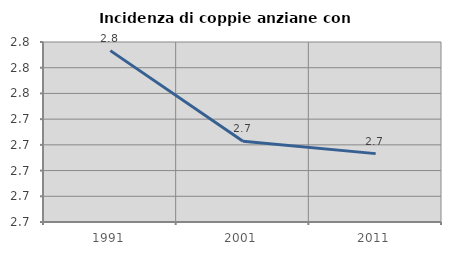
| Category | Incidenza di coppie anziane con figli |
|---|---|
| 1991.0 | 2.793 |
| 2001.0 | 2.723 |
| 2011.0 | 2.713 |